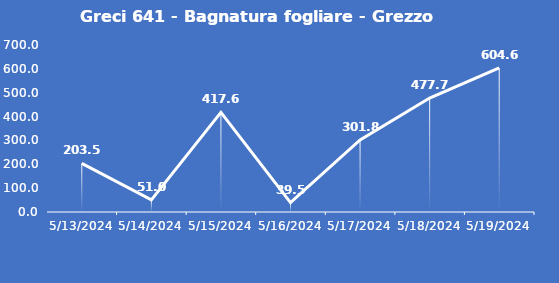
| Category | Greci 641 - Bagnatura fogliare - Grezzo (min) |
|---|---|
| 5/13/24 | 203.5 |
| 5/14/24 | 51 |
| 5/15/24 | 417.6 |
| 5/16/24 | 39.5 |
| 5/17/24 | 301.8 |
| 5/18/24 | 477.7 |
| 5/19/24 | 604.6 |